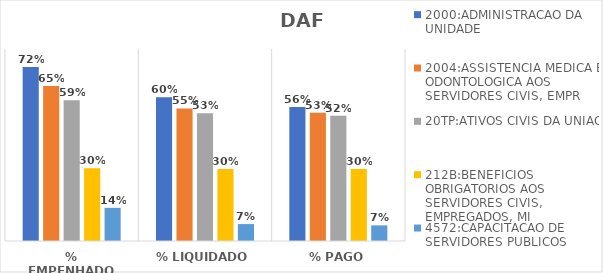
| Category | 2000:ADMINISTRACAO DA UNIDADE | 2004:ASSISTENCIA MEDICA E ODONTOLOGICA AOS SERVIDORES CIVIS, EMPR | 20TP:ATIVOS CIVIS DA UNIAO | 212B:BENEFICIOS OBRIGATORIOS AOS SERVIDORES CIVIS, EMPREGADOS, MI | 4572:CAPACITACAO DE SERVIDORES PUBLICOS FEDERAIS EM PROCESSO DE Q |
|---|---|---|---|---|---|
| % EMPENHADO | 0.725 | 0.646 | 0.587 | 0.303 | 0.138 |
| % LIQUIDADO | 0.599 | 0.552 | 0.532 | 0.3 | 0.071 |
| % PAGO | 0.558 | 0.534 | 0.522 | 0.3 | 0.065 |